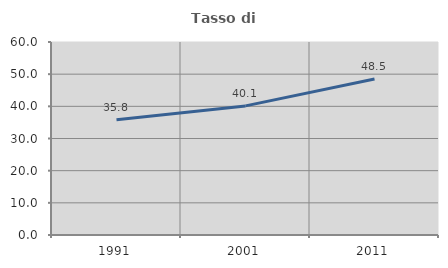
| Category | Tasso di occupazione   |
|---|---|
| 1991.0 | 35.842 |
| 2001.0 | 40.136 |
| 2011.0 | 48.495 |